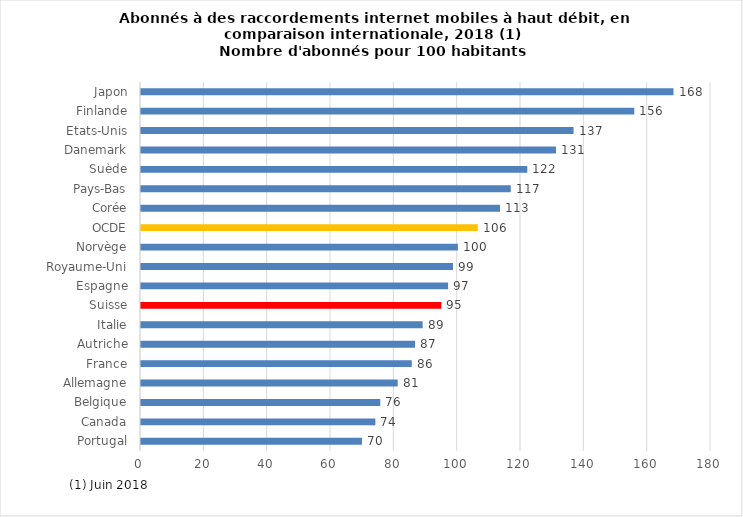
| Category | Series 0 |
|---|---|
| Portugal | 69.78 |
| Canada | 74.01 |
| Belgique | 75.57 |
| Allemagne | 81.07 |
| France | 85.5 |
| Autriche | 86.55 |
| Italie | 88.94 |
| Suisse | 94.84 |
| Espagne | 96.99 |
| Royaume-Uni | 98.52 |
| Norvège | 100.07 |
| OCDE | 106.35 |
| Corée | 113.37 |
| Pays-Bas | 116.76 |
| Suède | 121.98 |
| Danemark | 131.05 |
| Etats-Unis | 136.6 |
| Finlande | 155.77 |
| Japon | 168.16 |